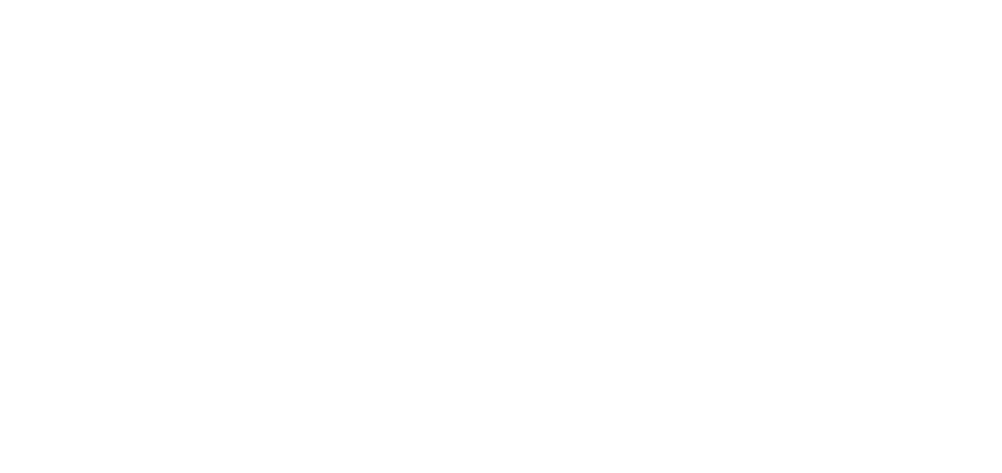
| Category | Total |
|---|---|
| Al Hodeidah | 573 |
| Hajjah | 486 |
| Taiz | 184 |
| Marib | 177 |
| Al Jawf | 163 |
| Amran | 148 |
| Hadramawt | 105 |
| Ad Dali | 95 |
| Lahj | 76 |
| Abyan | 65 |
| Ibb | 56 |
| Sanaa | 51 |
| Al Bayda | 35 |
| Aden | 34 |
| Sadah | 25 |
| Shabwah | 17 |
| Dhamar | 16 |
| Al Maharah | 12 |
| Al Mahwit | 9 |
| Raymah | 8 |
| Sanaa City | 4 |
| Socotra | 1 |